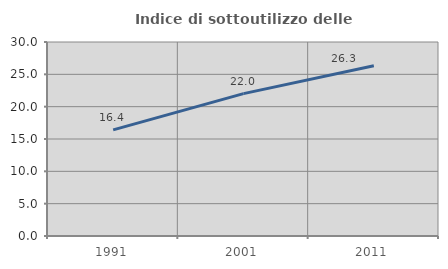
| Category | Indice di sottoutilizzo delle abitazioni  |
|---|---|
| 1991.0 | 16.41 |
| 2001.0 | 22.016 |
| 2011.0 | 26.321 |